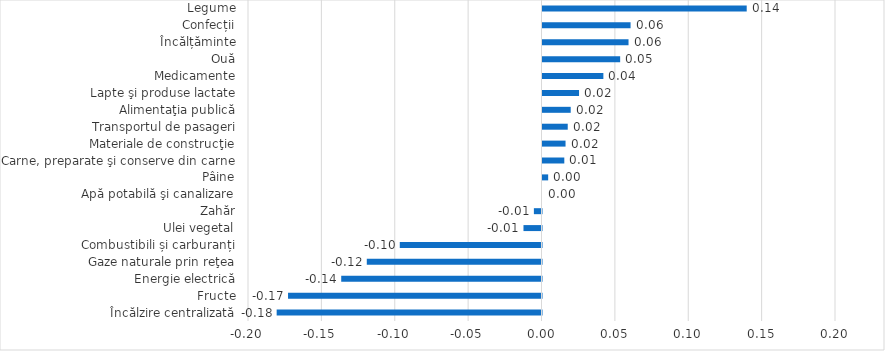
| Category | Series 0 |
|---|---|
| Încălzire centralizată | -0.18 |
| Fructe | -0.173 |
| Energie electrică | -0.136 |
| Gaze naturale prin reţea | -0.119 |
| Combustibili și carburanți | -0.097 |
| Ulei vegetal | -0.012 |
| Zahăr | -0.005 |
| Apă potabilă şi canalizare | 0 |
| Pâine | 0.004 |
| Carne, preparate şi conserve din carne | 0.015 |
| Materiale de construcţie | 0.016 |
| Transportul de pasageri | 0.017 |
| Alimentaţia publică | 0.019 |
| Lapte şi produse lactate | 0.025 |
| Medicamente | 0.041 |
| Ouă | 0.053 |
| Încălțăminte | 0.059 |
| Confecții | 0.06 |
| Legume | 0.139 |